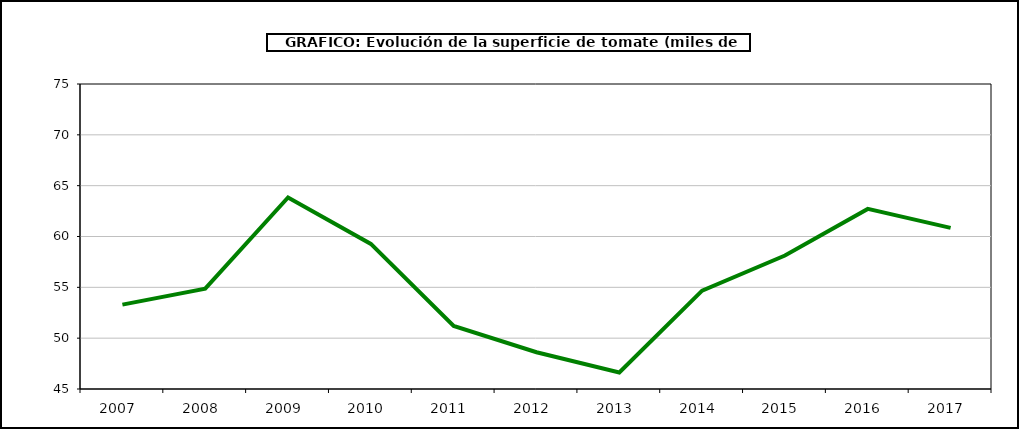
| Category | superficie |
|---|---|
| 2007.0 | 53.297 |
| 2008.0 | 54.868 |
| 2009.0 | 63.838 |
| 2010.0 | 59.267 |
| 2011.0 | 51.204 |
| 2012.0 | 48.617 |
| 2013.0 | 46.623 |
| 2014.0 | 54.675 |
| 2015.0 | 58.134 |
| 2016.0 | 62.715 |
| 2017.0 | 60.852 |